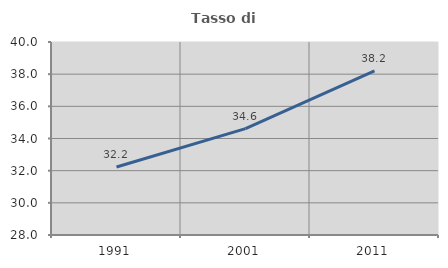
| Category | Tasso di occupazione   |
|---|---|
| 1991.0 | 32.226 |
| 2001.0 | 34.615 |
| 2011.0 | 38.211 |